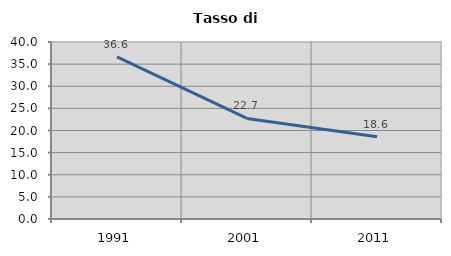
| Category | Tasso di disoccupazione   |
|---|---|
| 1991.0 | 36.638 |
| 2001.0 | 22.72 |
| 2011.0 | 18.593 |